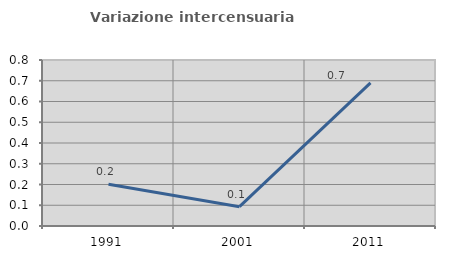
| Category | Variazione intercensuaria annua |
|---|---|
| 1991.0 | 0.201 |
| 2001.0 | 0.093 |
| 2011.0 | 0.69 |